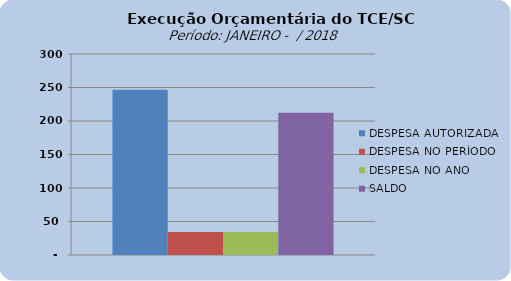
| Category | DESPESA AUTORIZADA | DESPESA NO PERÍODO | DESPESA NO ANO | SALDO |
|---|---|---|---|---|
| 0 | 246752013.28 | 34426590.31 | 34426590.31 | 212325422.97 |